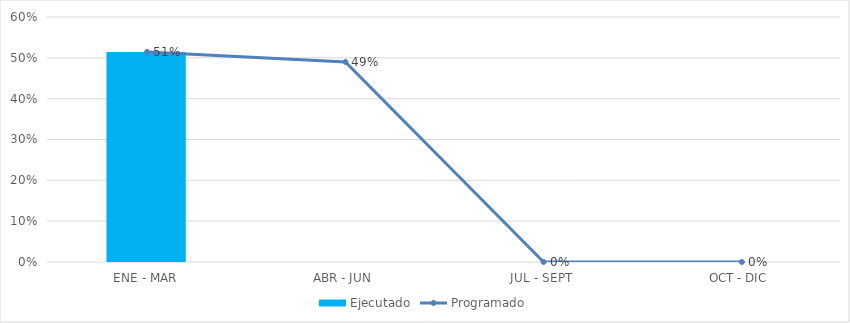
| Category | Ejecutado |
|---|---|
| ENE - MAR | 0.515 |
| ABR - JUN | 0 |
| JUL - SEPT | 0 |
| OCT - DIC | 0 |